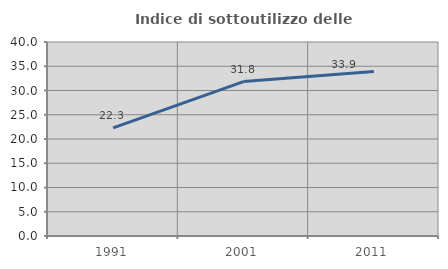
| Category | Indice di sottoutilizzo delle abitazioni  |
|---|---|
| 1991.0 | 22.302 |
| 2001.0 | 31.837 |
| 2011.0 | 33.913 |